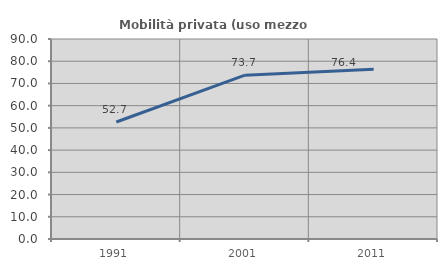
| Category | Mobilità privata (uso mezzo privato) |
|---|---|
| 1991.0 | 52.664 |
| 2001.0 | 73.734 |
| 2011.0 | 76.439 |